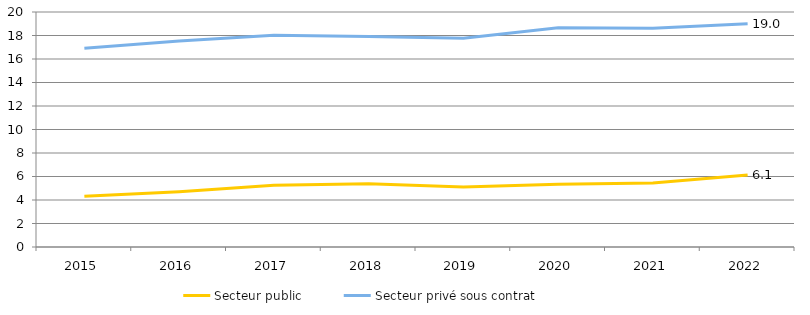
| Category | Secteur public | Secteur privé sous contrat |
|---|---|---|
| 2015.0 | 4.312 | 16.921 |
| 2016.0 | 4.697 | 17.522 |
| 2017.0 | 5.257 | 18.028 |
| 2018.0 | 5.376 | 17.925 |
| 2019.0 | 5.11 | 17.771 |
| 2020.0 | 5.332 | 18.666 |
| 2021.0 | 5.442 | 18.61 |
| 2022.0 | 6.119 | 18.997 |